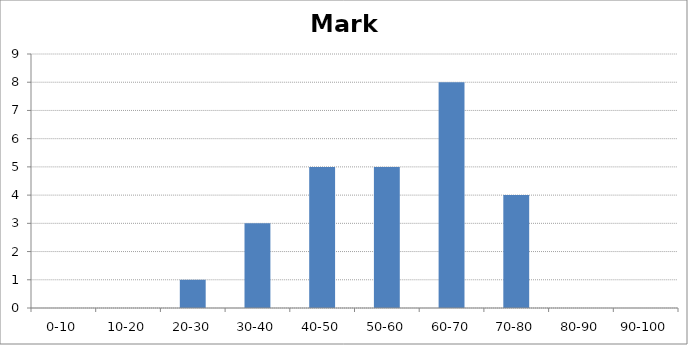
| Category | Marks |
|---|---|
| 0-10 | 0 |
| 10-20 | 0 |
| 20-30 | 1 |
| 30-40 | 3 |
| 40-50 | 5 |
| 50-60 | 5 |
| 60-70 | 8 |
| 70-80 | 4 |
| 80-90 | 0 |
| 90-100 | 0 |